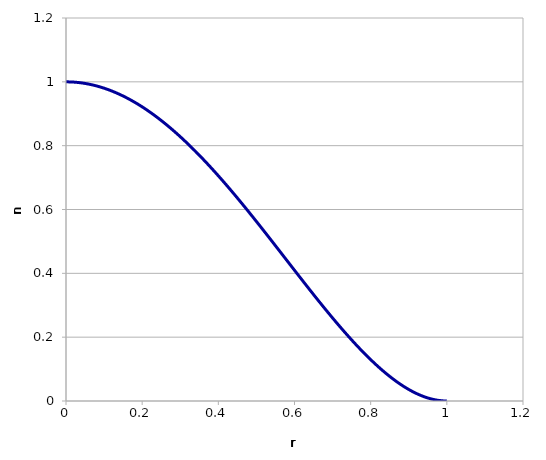
| Category | n |
|---|---|
| 0.0 | 1 |
| 0.01 | 1 |
| 0.02 | 0.999 |
| 0.03 | 0.998 |
| 0.04 | 0.997 |
| 0.05 | 0.995 |
| 0.06 | 0.993 |
| 0.07 | 0.99 |
| 0.08 | 0.987 |
| 0.09 | 0.984 |
| 0.1 | 0.98 |
| 0.11 | 0.976 |
| 0.12 | 0.971 |
| 0.13 | 0.966 |
| 0.14 | 0.961 |
| 0.15 | 0.956 |
| 0.16 | 0.949 |
| 0.17 | 0.943 |
| 0.18 | 0.936 |
| 0.19 | 0.929 |
| 0.2 | 0.922 |
| 0.21 | 0.914 |
| 0.22 | 0.906 |
| 0.23 | 0.897 |
| 0.24 | 0.888 |
| 0.25 | 0.879 |
| 0.26 | 0.869 |
| 0.27 | 0.86 |
| 0.28 | 0.849 |
| 0.29 | 0.839 |
| 0.3 | 0.828 |
| 0.31 | 0.817 |
| 0.32 | 0.806 |
| 0.33 | 0.794 |
| 0.34 | 0.782 |
| 0.35 | 0.77 |
| 0.36 | 0.758 |
| 0.37 | 0.745 |
| 0.38 | 0.732 |
| 0.39 | 0.719 |
| 0.4 | 0.706 |
| 0.41 | 0.692 |
| 0.42 | 0.678 |
| 0.43 | 0.664 |
| 0.44 | 0.65 |
| 0.45 | 0.636 |
| 0.46 | 0.622 |
| 0.47 | 0.607 |
| 0.48 | 0.592 |
| 0.49 | 0.577 |
| 0.5 | 0.563 |
| 0.51 | 0.547 |
| 0.52 | 0.532 |
| 0.53 | 0.517 |
| 0.54 | 0.502 |
| 0.55 | 0.487 |
| 0.56 | 0.471 |
| 0.57 | 0.456 |
| 0.58 | 0.44 |
| 0.59 | 0.425 |
| 0.6 | 0.41 |
| 0.61 | 0.394 |
| 0.62 | 0.379 |
| 0.63 | 0.364 |
| 0.64 | 0.349 |
| 0.65 | 0.334 |
| 0.66 | 0.319 |
| 0.67 | 0.304 |
| 0.68 | 0.289 |
| 0.69 | 0.274 |
| 0.7 | 0.26 |
| 0.71 | 0.246 |
| 0.72 | 0.232 |
| 0.73 | 0.218 |
| 0.74 | 0.205 |
| 0.75 | 0.191 |
| 0.76 | 0.178 |
| 0.77 | 0.166 |
| 0.78 | 0.153 |
| 0.79 | 0.141 |
| 0.8 | 0.13 |
| 0.81 | 0.118 |
| 0.82 | 0.107 |
| 0.83 | 0.097 |
| 0.84 | 0.087 |
| 0.85 | 0.077 |
| 0.86 | 0.068 |
| 0.87 | 0.059 |
| 0.88 | 0.051 |
| 0.89 | 0.043 |
| 0.9 | 0.036 |
| 0.91 | 0.03 |
| 0.92 | 0.024 |
| 0.93 | 0.018 |
| 0.94 | 0.014 |
| 0.95 | 0.01 |
| 0.96 | 0.006 |
| 0.97 | 0.004 |
| 0.98 | 0.002 |
| 0.99 | 0 |
| 1.0 | 0 |